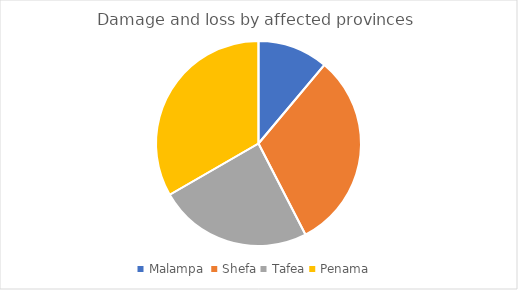
| Category | Series 0 |
|---|---|
| Malampa  | 11 |
| Shefa | 31 |
| Tafea | 24 |
| Penama | 33 |